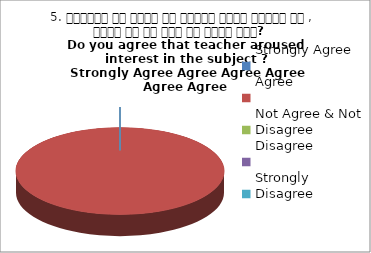
| Category | 5. शिक्षक ने विषय के प्रति रूचि जागृत की , क्या आप इस बात से सहमत हैं?  
Do you agree that teacher aroused interest in the subject ?
 Strongly Agree Agree Agree Agree Agree Agree |
|---|---|
| Strongly Agree | 0 |
| Agree | 4 |
| Not Agree & Not Disagree | 0 |
| Disagree | 0 |
| Strongly Disagree | 0 |